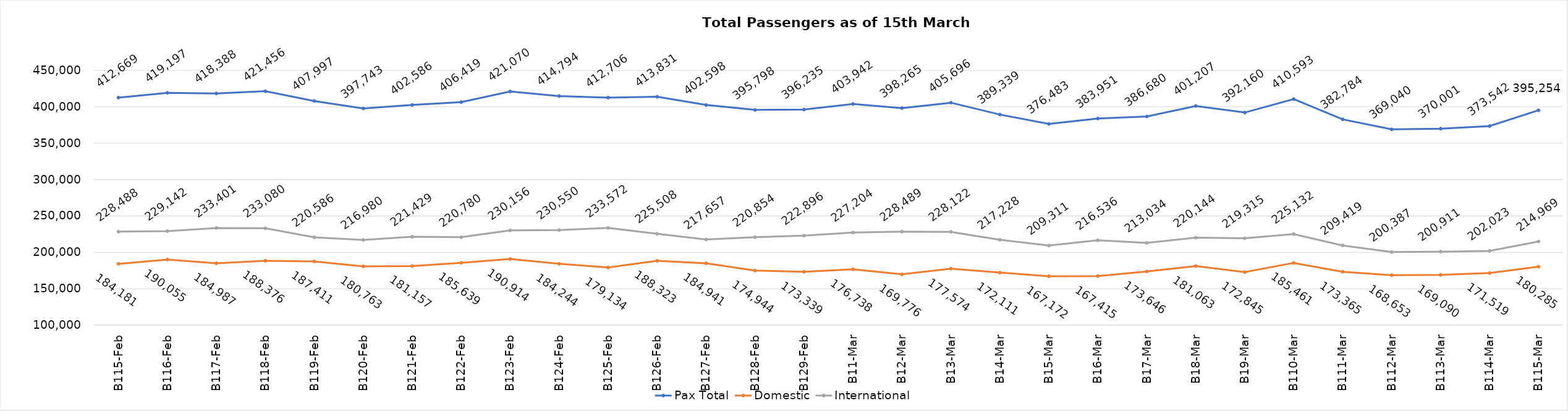
| Category | Pax Total | Domestic | International |
|---|---|---|---|
| 2024-02-15 | 412669 | 184181 | 228488 |
| 2024-02-16 | 419197 | 190055 | 229142 |
| 2024-02-17 | 418388 | 184987 | 233401 |
| 2024-02-18 | 421456 | 188376 | 233080 |
| 2024-02-19 | 407997 | 187411 | 220586 |
| 2024-02-20 | 397743 | 180763 | 216980 |
| 2024-02-21 | 402586 | 181157 | 221429 |
| 2024-02-22 | 406419 | 185639 | 220780 |
| 2024-02-23 | 421070 | 190914 | 230156 |
| 2024-02-24 | 414794 | 184244 | 230550 |
| 2024-02-25 | 412706 | 179134 | 233572 |
| 2024-02-26 | 413831 | 188323 | 225508 |
| 2024-02-27 | 402598 | 184941 | 217657 |
| 2024-02-28 | 395798 | 174944 | 220854 |
| 2024-02-29 | 396235 | 173339 | 222896 |
| 2024-03-01 | 403942 | 176738 | 227204 |
| 2024-03-02 | 398265 | 169776 | 228489 |
| 2024-03-03 | 405696 | 177574 | 228122 |
| 2024-03-04 | 389339 | 172111 | 217228 |
| 2024-03-05 | 376483 | 167172 | 209311 |
| 2024-03-06 | 383951 | 167415 | 216536 |
| 2024-03-07 | 386680 | 173646 | 213034 |
| 2024-03-08 | 401207 | 181063 | 220144 |
| 2024-03-09 | 392160 | 172845 | 219315 |
| 2024-03-10 | 410593 | 185461 | 225132 |
| 2024-03-11 | 382784 | 173365 | 209419 |
| 2024-03-12 | 369040 | 168653 | 200387 |
| 2024-03-13 | 370001 | 169090 | 200911 |
| 2024-03-14 | 373542 | 171519 | 202023 |
| 2024-03-15 | 395254 | 180285 | 214969 |